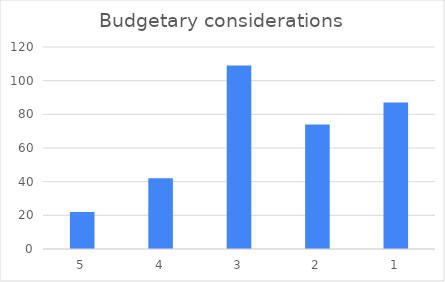
| Category | Series 0 |
|---|---|
| 5 | 22 |
| 4 | 42 |
| 3 | 109 |
| 2 | 74 |
| 1 | 87 |